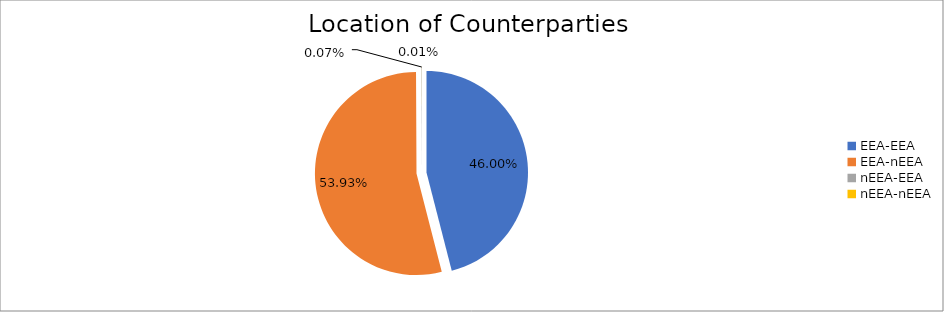
| Category | Series 0 |
|---|---|
| EEA-EEA | 6055472.645 |
| EEA-nEEA | 7099691.633 |
| nEEA-EEA | 9058.271 |
| nEEA-nEEA | 820.037 |